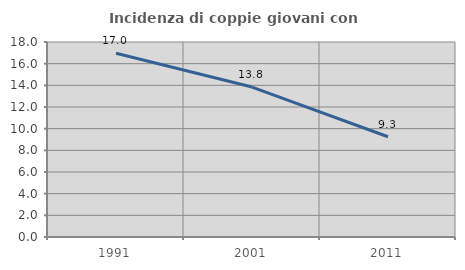
| Category | Incidenza di coppie giovani con figli |
|---|---|
| 1991.0 | 16.968 |
| 2001.0 | 13.842 |
| 2011.0 | 9.252 |